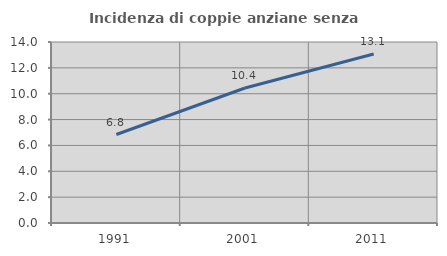
| Category | Incidenza di coppie anziane senza figli  |
|---|---|
| 1991.0 | 6.845 |
| 2001.0 | 10.44 |
| 2011.0 | 13.075 |